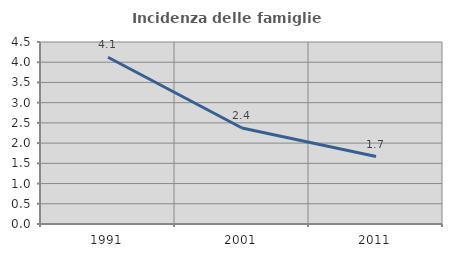
| Category | Incidenza delle famiglie numerose |
|---|---|
| 1991.0 | 4.123 |
| 2001.0 | 2.373 |
| 2011.0 | 1.667 |